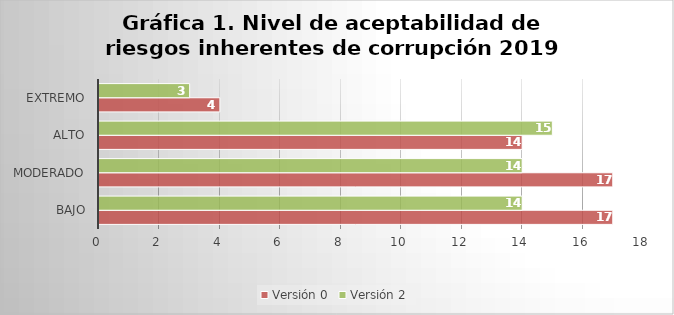
| Category | Versión 0 | Versión 2 |
|---|---|---|
| Bajo | 17 | 14 |
| Moderado | 17 | 14 |
| Alto | 14 | 15 |
| Extremo | 4 | 3 |